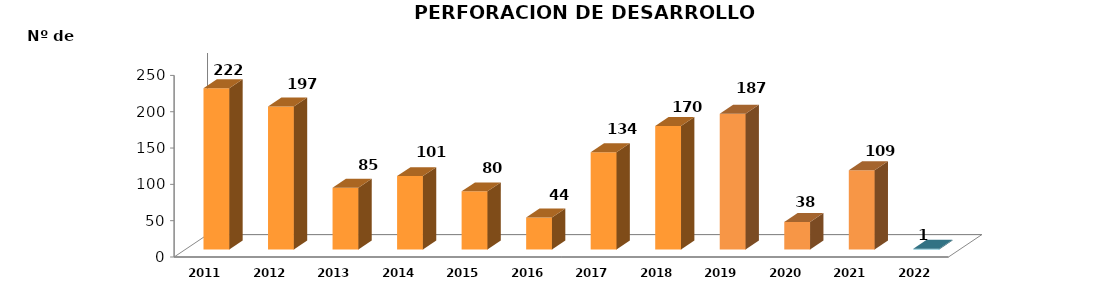
| Category | Series 0 |
|---|---|
| 2011.0 | 222 |
| 2012.0 | 197 |
| 2013.0 | 85 |
| 2014.0 | 101 |
| 2015.0 | 80 |
| 2016.0 | 44 |
| 2017.0 | 134 |
| 2018.0 | 170 |
| 2019.0 | 187 |
| 2020.0 | 38 |
| 2021.0 | 109 |
| 2022.0 | 1 |